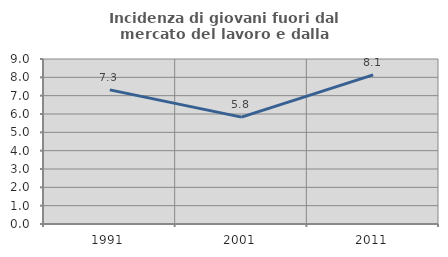
| Category | Incidenza di giovani fuori dal mercato del lavoro e dalla formazione  |
|---|---|
| 1991.0 | 7.317 |
| 2001.0 | 5.831 |
| 2011.0 | 8.133 |